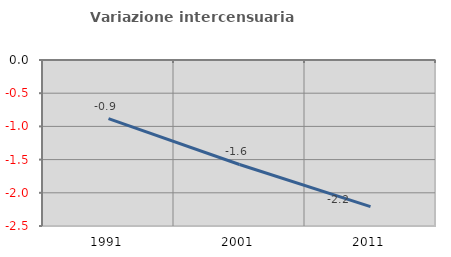
| Category | Variazione intercensuaria annua |
|---|---|
| 1991.0 | -0.883 |
| 2001.0 | -1.574 |
| 2011.0 | -2.209 |